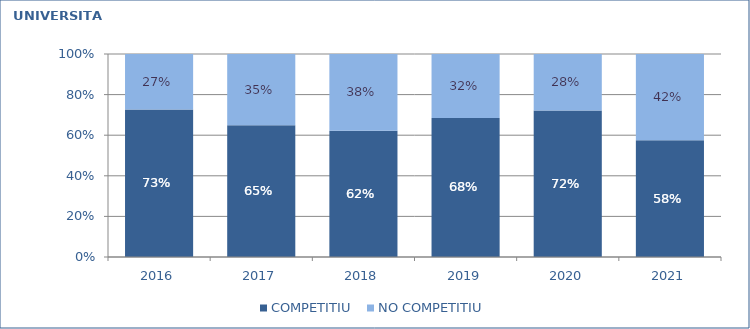
| Category | COMPETITIU  | NO COMPETITIU |
|---|---|---|
| 2016.0 | 0.727 | 0.273 |
| 2017.0 | 0.65 | 0.35 |
| 2018.0 | 0.622 | 0.378 |
| 2019.0 | 0.685 | 0.315 |
| 2020.0 | 0.722 | 0.278 |
| 2021.0 | 0.575 | 0.425 |